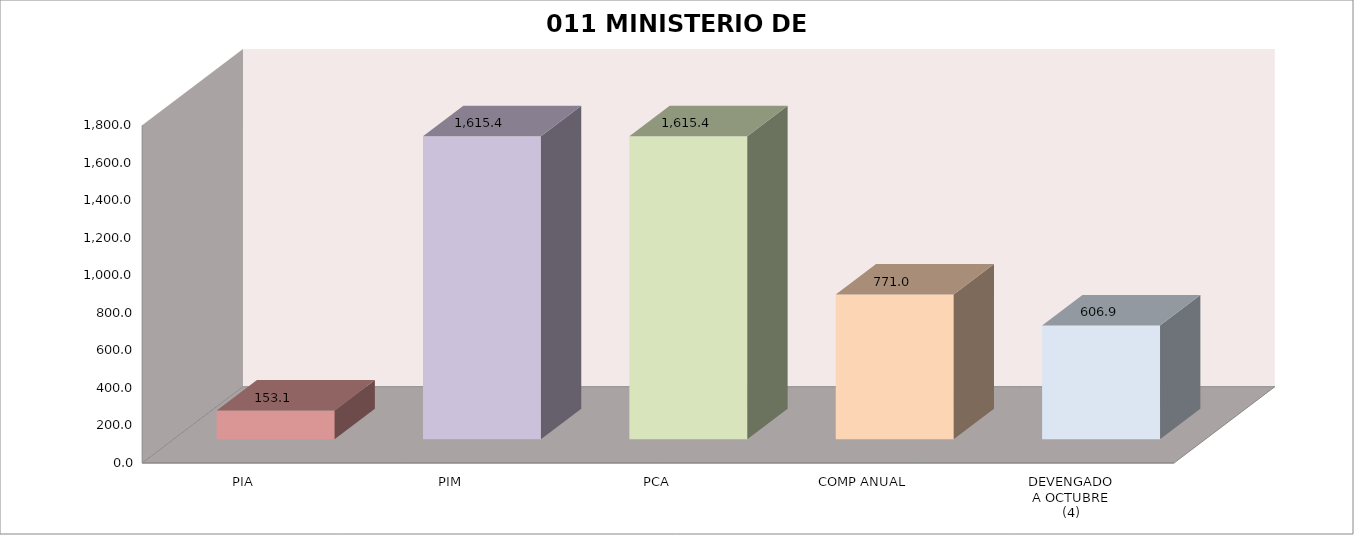
| Category | 011 MINISTERIO DE SALUD |
|---|---|
| PIA | 153.071 |
| PIM | 1615.409 |
| PCA | 1615.409 |
| COMP ANUAL | 770.955 |
| DEVENGADO
A OCTUBRE
(4) | 606.878 |